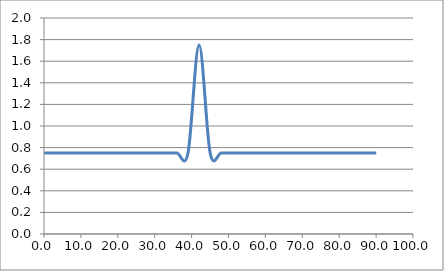
| Category | Elevation (in.) |
|---|---|
| 0.024 | 0.75 |
| 3.024 | 0.75 |
| 6.024 | 0.75 |
| 9.024000000000001 | 0.75 |
| 12.024000000000001 | 0.75 |
| 15.024000000000001 | 0.75 |
| 18.024 | 0.75 |
| 21.024 | 0.75 |
| 24.023999999999997 | 0.75 |
| 27.023999999999997 | 0.75 |
| 30.023999999999997 | 0.75 |
| 33.024 | 0.75 |
| 36.024 | 0.75 |
| 39.024 | 0.75 |
| 42.024 | 1.75 |
| 45.024 | 0.75 |
| 48.024 | 0.75 |
| 51.024 | 0.75 |
| 54.024 | 0.75 |
| 57.024 | 0.75 |
| 60.024 | 0.75 |
| 63.024 | 0.75 |
| 66.024 | 0.75 |
| 69.024 | 0.75 |
| 72.024 | 0.75 |
| 75.024 | 0.75 |
| 78.024 | 0.75 |
| 81.024 | 0.75 |
| 84.024 | 0.75 |
| 87.024 | 0.75 |
| 90.024 | 0.75 |